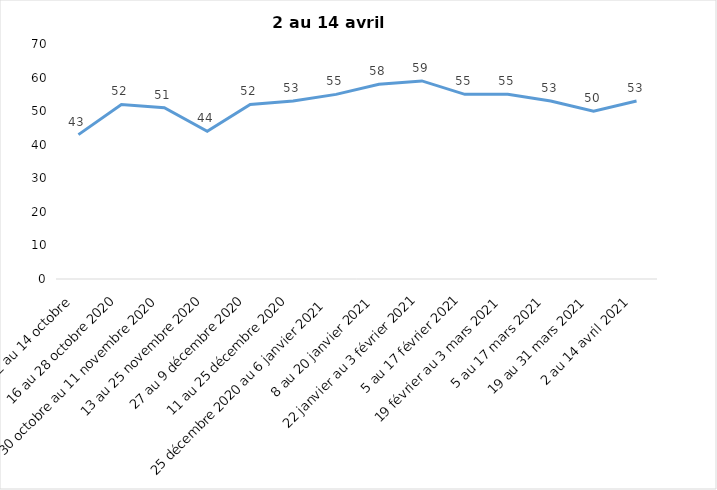
| Category | Toujours aux trois mesures |
|---|---|
| 2 au 14 octobre  | 43 |
| 16 au 28 octobre 2020 | 52 |
| 30 octobre au 11 novembre 2020 | 51 |
| 13 au 25 novembre 2020 | 44 |
| 27 au 9 décembre 2020 | 52 |
| 11 au 25 décembre 2020 | 53 |
| 25 décembre 2020 au 6 janvier 2021 | 55 |
| 8 au 20 janvier 2021 | 58 |
| 22 janvier au 3 février 2021 | 59 |
| 5 au 17 février 2021 | 55 |
| 19 février au 3 mars 2021 | 55 |
| 5 au 17 mars 2021 | 53 |
| 19 au 31 mars 2021 | 50 |
| 2 au 14 avril 2021 | 53 |